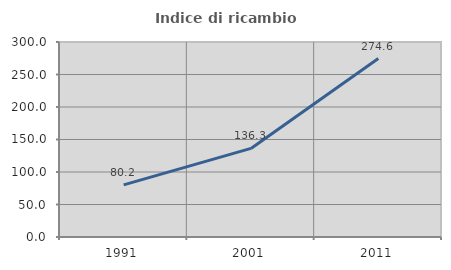
| Category | Indice di ricambio occupazionale  |
|---|---|
| 1991.0 | 80.199 |
| 2001.0 | 136.296 |
| 2011.0 | 274.567 |